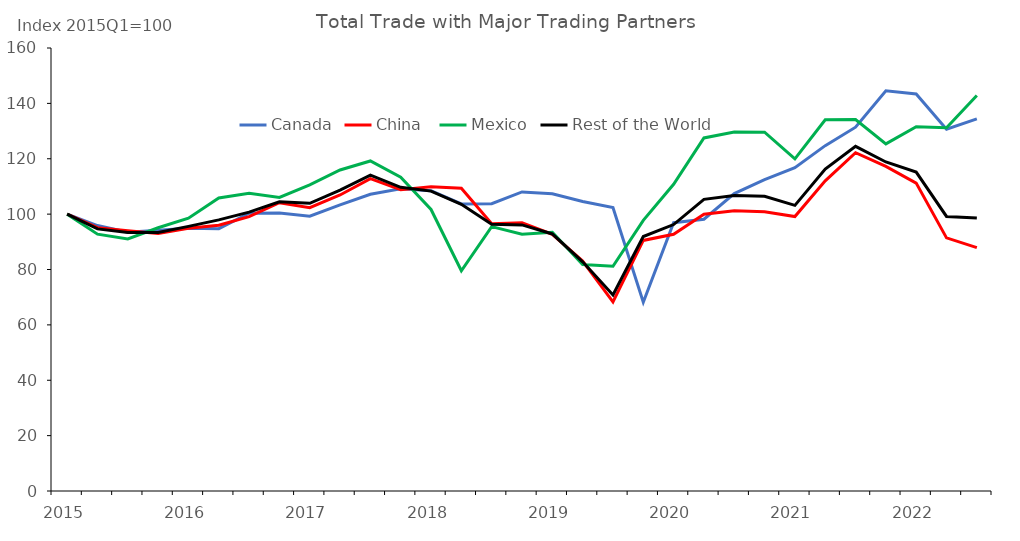
| Category | Canada | China  | Mexico | Rest of the World |
|---|---|---|---|---|
| 2015.0 | 100 | 100 | 100 | 100 |
| nan | 95.868 | 95.125 | 92.76 | 94.666 |
| nan | 93.46 | 93.981 | 91.027 | 93.407 |
| nan | 94.215 | 92.988 | 95.065 | 93.391 |
| 2016.0 | 94.921 | 94.87 | 98.548 | 95.584 |
| nan | 94.742 | 96.002 | 105.835 | 97.911 |
| nan | 100.339 | 99.076 | 107.529 | 100.717 |
| nan | 100.381 | 104.106 | 106.002 | 104.474 |
| 2017.0 | 99.279 | 102.303 | 110.575 | 103.909 |
| nan | 103.33 | 106.916 | 115.928 | 108.666 |
| nan | 107.169 | 112.829 | 119.198 | 114.065 |
| nan | 109.159 | 108.807 | 113.307 | 109.681 |
| 2018.0 | 108.446 | 109.912 | 101.676 | 108.313 |
| nan | 103.7 | 109.347 | 79.553 | 103.562 |
| nan | 103.788 | 96.514 | 95.492 | 96.316 |
| nan | 108.005 | 96.922 | 92.743 | 96.111 |
| 2019.0 | 107.378 | 92.69 | 93.451 | 92.837 |
| nan | 104.589 | 83.02 | 81.833 | 82.79 |
| nan | 102.379 | 68.301 | 81.19 | 70.804 |
| nan | 68.194 | 90.505 | 97.761 | 91.914 |
| 2020.0 | 96.908 | 92.731 | 110.759 | 96.231 |
| nan | 98.17 | 99.974 | 127.521 | 105.323 |
| nan | 107.444 | 101.229 | 129.645 | 106.746 |
| nan | 112.456 | 100.889 | 129.575 | 106.459 |
| 2021.0 | 116.797 | 99.115 | 119.971 | 103.165 |
| nan | 124.74 | 112.002 | 134.088 | 116.291 |
| nan | 131.411 | 122.168 | 134.136 | 124.492 |
| nan | 144.573 | 117.252 | 125.379 | 118.83 |
| 2022.0 | 143.394 | 111.212 | 131.572 | 115.165 |
| nan | 130.674 | 91.426 | 131.23 | 99.155 |
| nan | 134.395 | 87.905 | 142.839 | 98.572 |